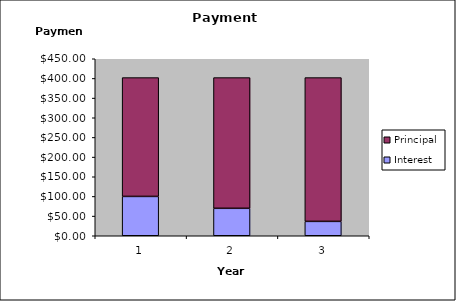
| Category | Interest | Principal |
|---|---|---|
| 0 | 100 | 302.115 |
| 1 | 69.789 | 332.326 |
| 2 | 36.556 | 365.559 |